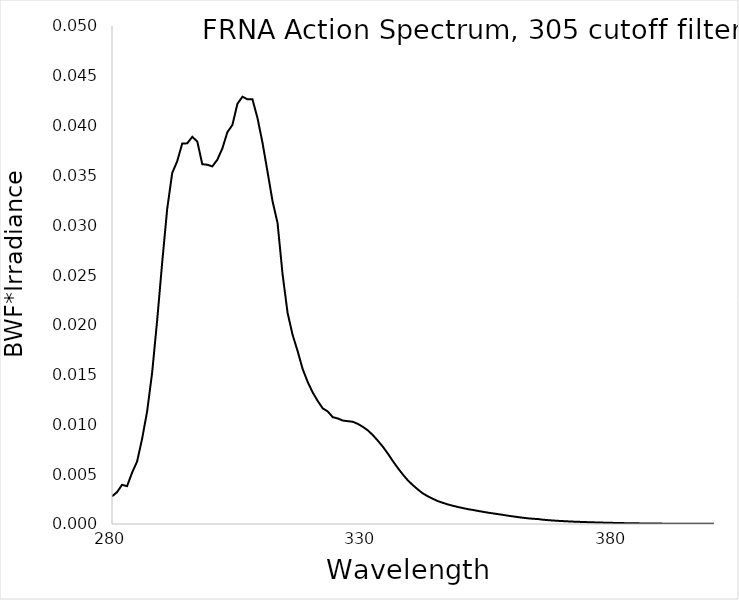
| Category | BWF |
|---|---|
| 280.0 | 0.003 |
| 281.0 | 0.003 |
| 282.0 | 0.004 |
| 283.0 | 0.004 |
| 284.0 | 0.005 |
| 285.0 | 0.006 |
| 286.0 | 0.009 |
| 287.0 | 0.011 |
| 288.0 | 0.015 |
| 289.0 | 0.02 |
| 290.0 | 0.026 |
| 291.0 | 0.032 |
| 292.0 | 0.035 |
| 293.0 | 0.036 |
| 294.0 | 0.038 |
| 295.0 | 0.038 |
| 296.0 | 0.039 |
| 297.0 | 0.038 |
| 298.0 | 0.036 |
| 299.0 | 0.036 |
| 300.0 | 0.036 |
| 301.0 | 0.037 |
| 302.0 | 0.038 |
| 303.0 | 0.039 |
| 304.0 | 0.04 |
| 305.0 | 0.042 |
| 306.0 | 0.043 |
| 307.0 | 0.043 |
| 308.0 | 0.043 |
| 309.0 | 0.041 |
| 310.0 | 0.038 |
| 311.0 | 0.035 |
| 312.0 | 0.032 |
| 313.0 | 0.03 |
| 314.0 | 0.025 |
| 315.0 | 0.021 |
| 316.0 | 0.019 |
| 317.0 | 0.017 |
| 318.0 | 0.016 |
| 319.0 | 0.014 |
| 320.0 | 0.013 |
| 321.0 | 0.012 |
| 322.0 | 0.012 |
| 323.0 | 0.011 |
| 324.0 | 0.011 |
| 325.0 | 0.011 |
| 326.0 | 0.01 |
| 327.0 | 0.01 |
| 328.0 | 0.01 |
| 329.0 | 0.01 |
| 330.0 | 0.01 |
| 331.0 | 0.009 |
| 332.0 | 0.009 |
| 333.0 | 0.008 |
| 334.0 | 0.008 |
| 335.0 | 0.007 |
| 336.0 | 0.006 |
| 337.0 | 0.006 |
| 338.0 | 0.005 |
| 339.0 | 0.004 |
| 340.0 | 0.004 |
| 341.0 | 0.003 |
| 342.0 | 0.003 |
| 343.0 | 0.003 |
| 344.0 | 0.003 |
| 345.0 | 0.002 |
| 346.0 | 0.002 |
| 347.0 | 0.002 |
| 348.0 | 0.002 |
| 349.0 | 0.002 |
| 350.0 | 0.002 |
| 351.0 | 0.001 |
| 352.0 | 0.001 |
| 353.0 | 0.001 |
| 354.0 | 0.001 |
| 355.0 | 0.001 |
| 356.0 | 0.001 |
| 357.0 | 0.001 |
| 358.0 | 0.001 |
| 359.0 | 0.001 |
| 360.0 | 0.001 |
| 361.0 | 0.001 |
| 362.0 | 0.001 |
| 363.0 | 0.001 |
| 364.0 | 0.001 |
| 365.0 | 0 |
| 366.0 | 0 |
| 367.0 | 0 |
| 368.0 | 0 |
| 369.0 | 0 |
| 370.0 | 0 |
| 371.0 | 0 |
| 372.0 | 0 |
| 373.0 | 0 |
| 374.0 | 0 |
| 375.0 | 0 |
| 376.0 | 0 |
| 377.0 | 0 |
| 378.0 | 0 |
| 379.0 | 0 |
| 380.0 | 0 |
| 381.0 | 0 |
| 382.0 | 0 |
| 383.0 | 0 |
| 384.0 | 0 |
| 385.0 | 0 |
| 386.0 | 0 |
| 387.0 | 0 |
| 388.0 | 0 |
| 389.0 | 0 |
| 390.0 | 0 |
| 391.0 | 0 |
| 392.0 | 0 |
| 393.0 | 0 |
| 394.0 | 0 |
| 395.0 | 0 |
| 396.0 | 0 |
| 397.0 | 0 |
| 398.0 | 0 |
| 399.0 | 0 |
| 400.0 | 0 |
| 401.0 | 0 |
| 402.0 | 0 |
| 403.0 | 0 |
| 404.0 | 0 |
| 405.0 | 0 |
| 406.0 | 0 |
| 407.0 | 0 |
| 408.0 | 0 |
| 409.0 | 0 |
| 410.0 | 0 |
| 411.0 | 0 |
| 412.0 | 0 |
| 413.0 | 0 |
| 414.0 | 0 |
| 415.0 | 0 |
| 416.0 | 0 |
| 417.0 | 0 |
| 418.0 | 0 |
| 419.0 | 0 |
| 420.0 | 0 |
| 421.0 | 0 |
| 422.0 | 0 |
| 423.0 | 0 |
| 424.0 | 0 |
| 425.0 | 0 |
| 426.0 | 0 |
| 427.0 | 0 |
| 428.0 | 0 |
| 429.0 | 0 |
| 430.0 | 0 |
| 431.0 | 0 |
| 432.0 | 0 |
| 433.0 | 0 |
| 434.0 | 0 |
| 435.0 | 0 |
| 436.0 | 0 |
| 437.0 | 0 |
| 438.0 | 0 |
| 439.0 | 0 |
| 440.0 | 0 |
| 441.0 | 0 |
| 442.0 | 0 |
| 443.0 | 0 |
| 444.0 | 0 |
| 445.0 | 0 |
| 446.0 | 0 |
| 447.0 | 0 |
| 448.0 | 0 |
| 449.0 | 0 |
| 450.0 | 0 |
| 451.0 | 0 |
| 452.0 | 0 |
| 453.0 | 0 |
| 454.0 | 0 |
| 455.0 | 0 |
| 456.0 | 0 |
| 457.0 | 0 |
| 458.0 | 0 |
| 459.0 | 0 |
| 460.0 | 0 |
| 461.0 | 0 |
| 462.0 | 0 |
| 463.0 | 0 |
| 464.0 | 0 |
| 465.0 | 0 |
| 466.0 | 0 |
| 467.0 | 0 |
| 468.0 | 0 |
| 469.0 | 0 |
| 470.0 | 0 |
| 471.0 | 0 |
| 472.0 | 0 |
| 473.0 | 0 |
| 474.0 | 0 |
| 475.0 | 0 |
| 476.0 | 0 |
| 477.0 | 0 |